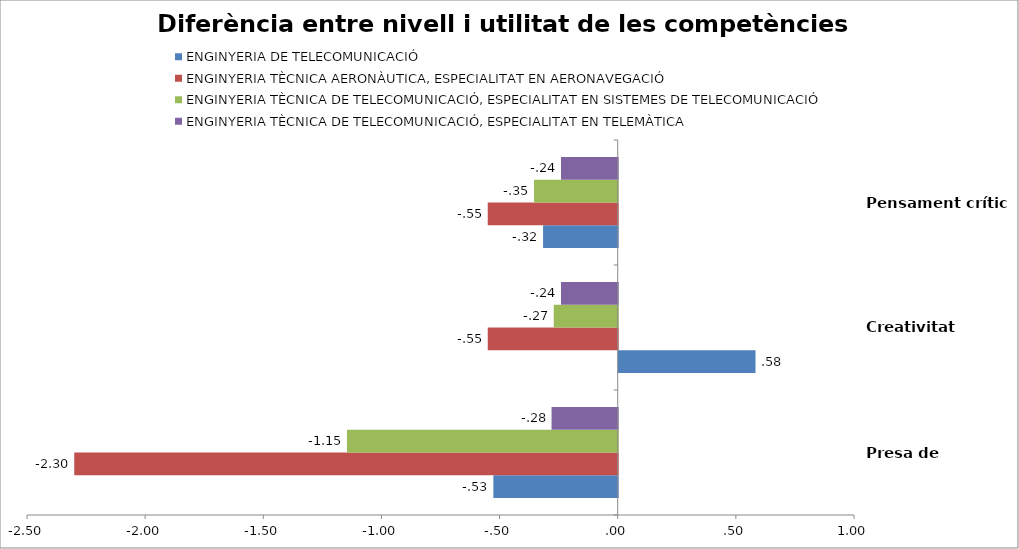
| Category | ENGINYERIA DE TELECOMUNICACIÓ | ENGINYERIA TÈCNICA AERONÀUTICA, ESPECIALITAT EN AERONAVEGACIÓ | ENGINYERIA TÈCNICA DE TELECOMUNICACIÓ, ESPECIALITAT EN SISTEMES DE TELECOMUNICACIÓ | ENGINYERIA TÈCNICA DE TELECOMUNICACIÓ, ESPECIALITAT EN TELEMÀTICA |
|---|---|---|---|---|
| Presa de decisions | -0.526 | -2.3 | -1.146 | -0.28 |
| Creativitat | 0.579 | -0.55 | -0.271 | -0.24 |
| Pensament crític | -0.316 | -0.55 | -0.354 | -0.24 |